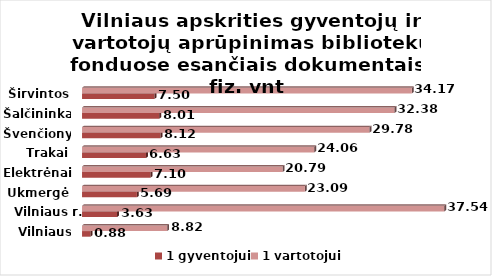
| Category | 1 gyventojui | 1 vartotojui |
|---|---|---|
| Vilniaus m. | 0.877 | 8.818 |
| Vilniaus r. | 3.631 | 37.539 |
| Ukmergė | 5.686 | 23.091 |
| Elektrėnai | 7.096 | 20.788 |
| Trakai | 6.625 | 24.064 |
| Švenčionys | 8.125 | 29.778 |
| Šalčininkai | 8.006 | 32.375 |
| Širvintos | 7.503 | 34.174 |